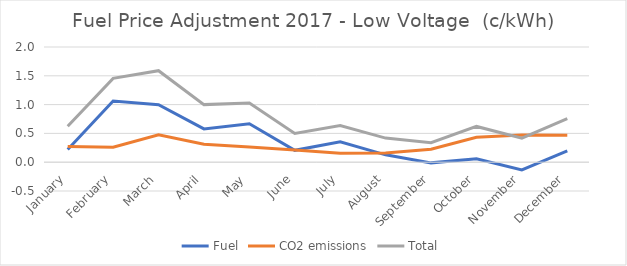
| Category | Fuel | CO2 emissions | Total |
|---|---|---|---|
| January | 0.221 | 0.271 | 0.624 |
| February | 1.061 | 0.259 | 1.455 |
| March | 0.998 | 0.476 | 1.588 |
| April | 0.577 | 0.311 | 1 |
| May | 0.667 | 0.265 | 1.029 |
| June | 0.206 | 0.211 | 0.5 |
| July | 0.356 | 0.154 | 0.636 |
| August | 0.128 | 0.159 | 0.419 |
| September | -0.012 | 0.227 | 0.338 |
| October | 0.059 | 0.432 | 0.621 |
| November | -0.135 | 0.473 | 0.419 |
| December | 0.197 | 0.469 | 0.758 |